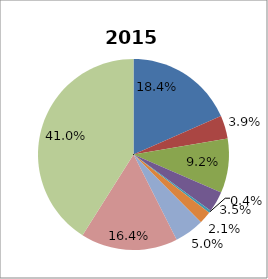
| Category | 2015 |
|---|---|
| Allgemeine öffentliche Verwaltung | 0.184 |
| Öffentliche Ordnung und Sicherheit | 0.039 |
| Wirtschaftliche Angelegenheiten | 0.092 |
| Umweltschutz | 0.035 |
| Wohnungswesen und kommunale Einrichtungen | 0.004 |
| Gesundheitswesen | 0.021 |
| Freizeitgestaltung, Sport, Kultur und Religion | 0.05 |
| Bildungswesen | 0.164 |
| Soziale Sicherung | 0.41 |